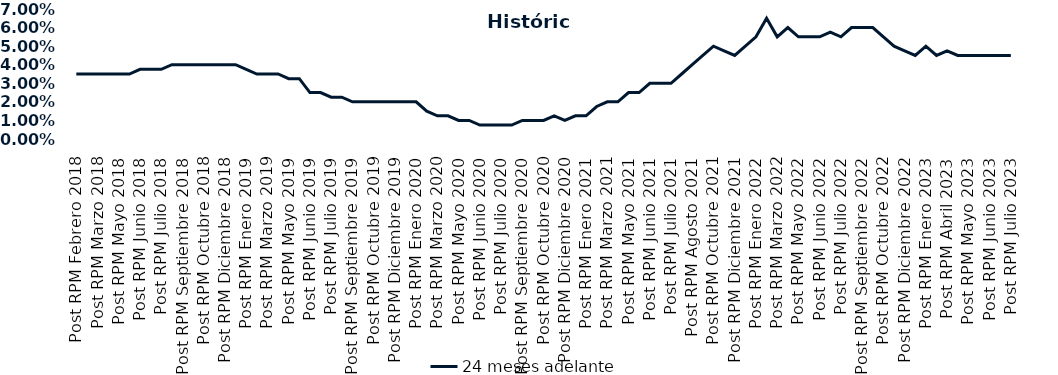
| Category | 24 meses adelante  |
|---|---|
| Post RPM Febrero 2018 | 0.035 |
| Pre RPM Marzo 2018 | 0.035 |
| Post RPM Marzo 2018 | 0.035 |
| Pre RPM Mayo 2018 | 0.035 |
| Post RPM Mayo 2018 | 0.035 |
| Pre RPM Junio 2018 | 0.035 |
| Post RPM Junio 2018 | 0.038 |
| Pre RPM Julio 2018 | 0.038 |
| Post RPM Julio 2018 | 0.038 |
| Pre RPM Septiembre 2018 | 0.04 |
| Post RPM Septiembre 2018 | 0.04 |
| Pre RPM Octubre 2018 | 0.04 |
| Post RPM Octubre 2018 | 0.04 |
| Pre RPM Diciembre 2018 | 0.04 |
| Post RPM Diciembre 2018 | 0.04 |
| Pre RPM Enero 2019 | 0.04 |
| Post RPM Enero 2019 | 0.038 |
| Pre RPM Marzo 2019 | 0.035 |
| Post RPM Marzo 2019 | 0.035 |
| Pre RPM Mayo 2019 | 0.035 |
| Post RPM Mayo 2019 | 0.032 |
| Pre RPM Junio 2019 | 0.032 |
| Post RPM Junio 2019 | 0.025 |
| Pre RPM Julio 2019 | 0.025 |
| Post RPM Julio 2019 | 0.022 |
| Pre RPM Septiembre 2019 | 0.022 |
| Post RPM Septiembre 2019 | 0.02 |
| Pre RPM Octubre 2019 | 0.02 |
| Post RPM Octubre 2019 | 0.02 |
| Pre RPM Diciembre 2019 | 0.02 |
| Post RPM Diciembre 2019 | 0.02 |
| Pre RPM Enero 2020 | 0.02 |
| Post RPM Enero 2020 | 0.02 |
| Pre RPM Marzo 2020 | 0.015 |
| Post RPM Marzo 2020 | 0.012 |
| Pre RPM Mayo 2020 | 0.012 |
| Post RPM Mayo 2020 | 0.01 |
| Pre RPM Junio 2020 | 0.01 |
| Post RPM Junio 2020 | 0.008 |
| Pre RPM Julio 2020 | 0.008 |
| Post RPM Julio 2020 | 0.008 |
| Pre RPM Septiembre 2020 | 0.008 |
| Post RPM Septiembre 2020 | 0.01 |
| Pre RPM Octubre 2020 | 0.01 |
| Post RPM Octubre 2020 | 0.01 |
| Pre RPM Diciembre 2020 | 0.012 |
| Post RPM Diciembre 2020 | 0.01 |
| Pre RPM Enero 2021 | 0.012 |
| Post RPM Enero 2021 | 0.012 |
| Pre RPM Marzo 2021 | 0.018 |
| Post RPM Marzo 2021 | 0.02 |
| Pre RPM Mayo 2021 | 0.02 |
| Post RPM Mayo 2021 | 0.025 |
| Pre RPM Junio 2021 | 0.025 |
| Post RPM Junio 2021 | 0.03 |
| Pre RPM Julio 2021 | 0.03 |
| Post RPM Julio 2021 | 0.03 |
| Pre RPM Agosto 2021 | 0.035 |
| Post RPM Agosto 2021 | 0.04 |
| Pre RPM Octubre 2021 | 0.045 |
| Post RPM Octubre 2021 | 0.05 |
| Pre RPM Diciembre 2021 | 0.048 |
| Post RPM Diciembre 2021 | 0.045 |
| Pre RPM Enero 2022 | 0.05 |
| Post RPM Enero 2022 | 0.055 |
| Pre RPM Marzo 2022 | 0.065 |
| Post RPM Marzo 2022 | 0.055 |
| Pre RPM Mayo 2022 | 0.06 |
| Post RPM Mayo 2022 | 0.055 |
| Pre RPM Junio 2022 | 0.055 |
| Post RPM Junio 2022 | 0.055 |
| Pre RPM Julio 2022 | 0.058 |
| Post RPM Julio 2022 | 0.055 |
| Pre RPM Septiembre 2022 | 0.06 |
| Post RPM Septiembre 2022 | 0.06 |
| Pre RPM Octubre 2022 | 0.06 |
| Post RPM Octubre 2022 | 0.055 |
| Pre RPM Diciembre 2022 | 0.05 |
| Post RPM Diciembre 2022 | 0.048 |
| Pre RPM Enero 2023 | 0.045 |
| Post RPM Enero 2023 | 0.05 |
| Pre RPM Abril 2023 | 0.045 |
| Post RPM Abril 2023 | 0.048 |
| Pre RPM Mayo 2023 | 0.045 |
| Post RPM Mayo 2023 | 0.045 |
| Pre RPM Junio 2023 | 0.045 |
| Post RPM Junio 2023 | 0.045 |
| Pre RPM Julio 2023 | 0.045 |
| Post RPM Julio 2023 | 0.045 |